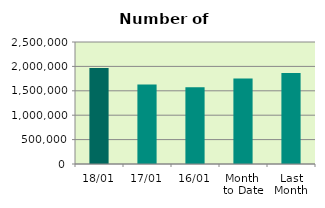
| Category | Series 0 |
|---|---|
| 18/01 | 1967548 |
| 17/01 | 1629130 |
| 16/01 | 1573688 |
| Month 
to Date | 1753260.462 |
| Last
Month | 1866821.895 |